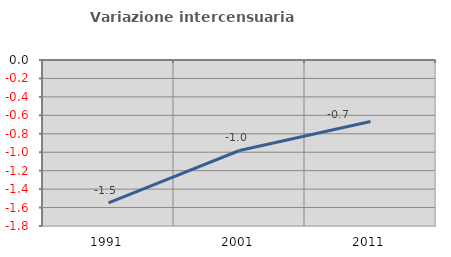
| Category | Variazione intercensuaria annua |
|---|---|
| 1991.0 | -1.549 |
| 2001.0 | -0.981 |
| 2011.0 | -0.667 |